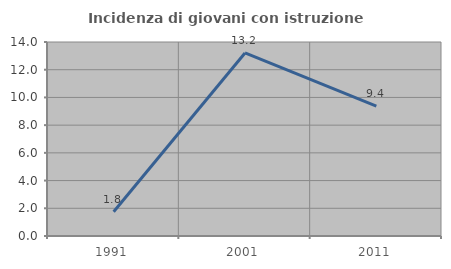
| Category | Incidenza di giovani con istruzione universitaria |
|---|---|
| 1991.0 | 1.754 |
| 2001.0 | 13.208 |
| 2011.0 | 9.375 |